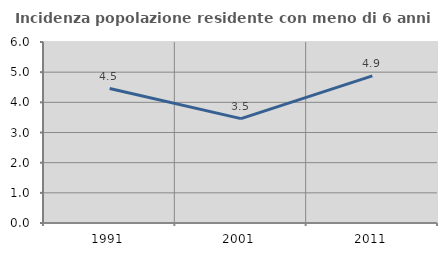
| Category | Incidenza popolazione residente con meno di 6 anni |
|---|---|
| 1991.0 | 4.456 |
| 2001.0 | 3.46 |
| 2011.0 | 4.875 |